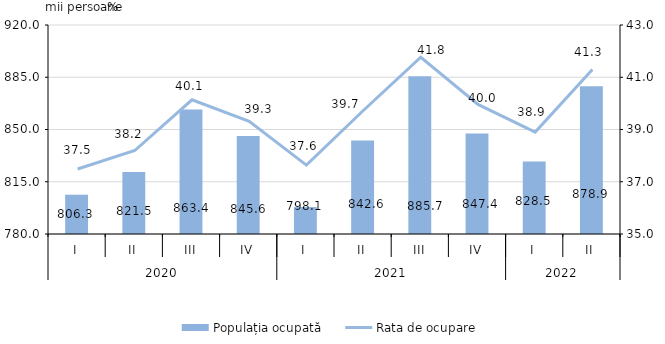
| Category | Populația ocupată |
|---|---|
| 0 | 806.327 |
| 1 | 821.515 |
| 2 | 863.351 |
| 3 | 845.568 |
| 4 | 798.054 |
| 5 | 842.611 |
| 6 | 885.715 |
| 7 | 847.401 |
| 8 | 828.5 |
| 9 | 878.9 |